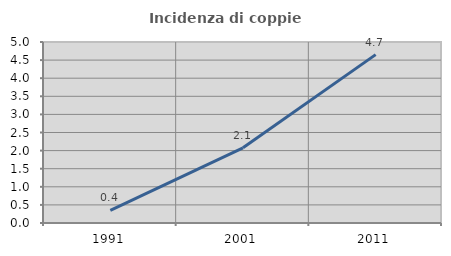
| Category | Incidenza di coppie miste |
|---|---|
| 1991.0 | 0.351 |
| 2001.0 | 2.076 |
| 2011.0 | 4.651 |